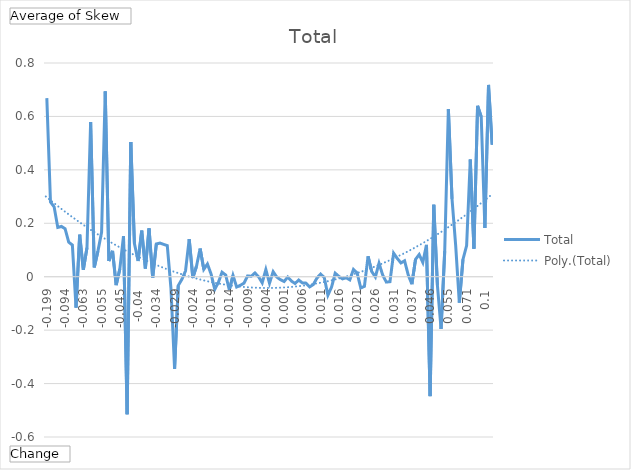
| Category | Total |
|---|---|
| -0.199 | 0.668 |
| -0.177 | 0.28 |
| -0.126 | 0.262 |
| -0.112 | 0.184 |
| -0.095 | 0.188 |
| -0.094 | 0.18 |
| -0.092 | 0.129 |
| -0.09 | 0.118 |
| -0.068 | -0.116 |
| -0.066 | 0.157 |
| -0.063 | 0.026 |
| -0.061 | 0.109 |
| -0.059 | 0.579 |
| -0.057 | 0.035 |
| -0.056 | 0.096 |
| -0.055 | 0.167 |
| -0.051 | 0.694 |
| -0.049 | 0.059 |
| -0.048 | 0.097 |
| -0.047 | -0.031 |
| -0.045 | 0.029 |
| -0.044 | 0.152 |
| -0.043 | -0.515 |
| -0.042 | 0.504 |
| -0.041 | 0.124 |
| -0.04 | 0.059 |
| -0.039 | 0.173 |
| -0.038 | 0.031 |
| -0.036 | 0.181 |
| -0.035 | -0.004 |
| -0.034 | 0.123 |
| -0.033 | 0.126 |
| -0.032 | 0.121 |
| -0.031 | 0.116 |
| -0.03 | -0.043 |
| -0.029 | -0.345 |
| -0.028 | -0.033 |
| -0.027 | -0.01 |
| -0.026 | 0.022 |
| -0.025 | 0.141 |
| -0.024 | -0.004 |
| -0.023 | 0.039 |
| -0.022 | 0.105 |
| -0.021 | 0.028 |
| -0.02 | 0.048 |
| -0.019 | 0.01 |
| -0.018 | -0.048 |
| -0.017 | -0.021 |
| -0.016 | 0.017 |
| -0.015 | 0.006 |
| -0.014 | -0.049 |
| -0.013 | 0.005 |
| -0.012 | -0.039 |
| -0.011 | -0.032 |
| -0.01 | -0.024 |
| -0.009 | 0.003 |
| -0.008 | 0.002 |
| -0.007 | 0.014 |
| -0.006 | 0 |
| -0.005 | -0.023 |
| -0.004 | 0.027 |
| -0.003 | -0.024 |
| -0.002 | 0.019 |
| -0.001 | -0.001 |
| 0 | -0.011 |
| 0.001 | -0.018 |
| 0.002 | -0.001 |
| 0.003 | -0.016 |
| 0.004 | -0.025 |
| 0.005 | -0.012 |
| 0.006 | -0.023 |
| 0.007 | -0.024 |
| 0.008 | -0.038 |
| 0.009 | -0.029 |
| 0.01 | -0.005 |
| 0.011 | 0.01 |
| 0.012 | -0.003 |
| 0.013 | -0.069 |
| 0.014 | -0.039 |
| 0.015 | 0.013 |
| 0.016 | 0.001 |
| 0.017 | -0.008 |
| 0.018 | -0.004 |
| 0.019 | -0.012 |
| 0.02 | 0.027 |
| 0.021 | 0.014 |
| 0.022 | -0.042 |
| 0.023 | -0.036 |
| 0.024 | 0.076 |
| 0.025 | 0.019 |
| 0.026 | -0.001 |
| 0.027 | 0.05 |
| 0.028 | 0.007 |
| 0.029 | -0.02 |
| 0.03 | -0.019 |
| 0.031 | 0.088 |
| 0.032 | 0.069 |
| 0.033 | 0.052 |
| 0.034 | 0.06 |
| 0.035 | 0.007 |
| 0.037 | -0.028 |
| 0.04 | 0.065 |
| 0.041 | 0.083 |
| 0.042 | 0.053 |
| 0.044 | 0.119 |
| 0.046 | -0.447 |
| 0.047 | 0.269 |
| 0.049 | -0.032 |
| 0.051 | -0.196 |
| 0.054 | 0.096 |
| 0.055 | 0.627 |
| 0.058 | 0.291 |
| 0.06 | 0.117 |
| 0.061 | -0.097 |
| 0.064 | 0.064 |
| 0.071 | 0.117 |
| 0.076 | 0.439 |
| 0.078 | 0.105 |
| 0.079 | 0.64 |
| 0.08 | 0.599 |
| 0.1 | 0.182 |
| 0.116 | 0.718 |
| 0.178 | 0.494 |